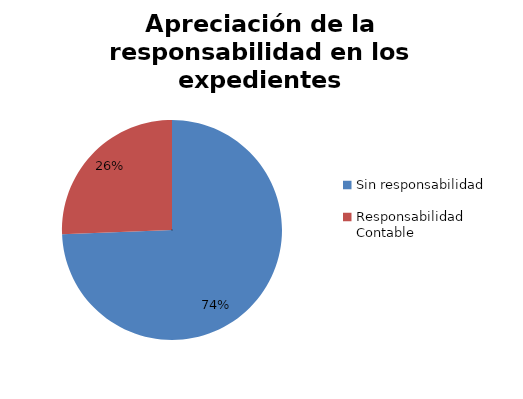
| Category | Series 0 |
|---|---|
| Sin responsabilidad | 215 |
| Responsabilidad Contable | 74 |
| Responsabilidad Penal | 0 |
| Otras Responsabilidades | 0 |